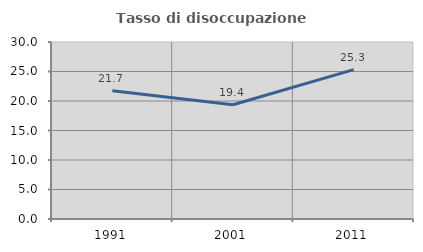
| Category | Tasso di disoccupazione giovanile  |
|---|---|
| 1991.0 | 21.739 |
| 2001.0 | 19.359 |
| 2011.0 | 25.321 |